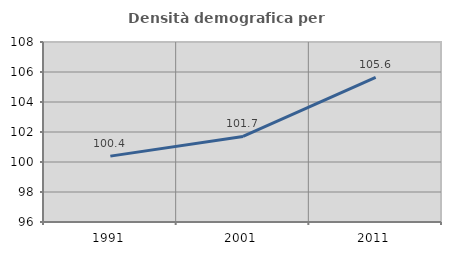
| Category | Densità demografica |
|---|---|
| 1991.0 | 100.391 |
| 2001.0 | 101.702 |
| 2011.0 | 105.635 |